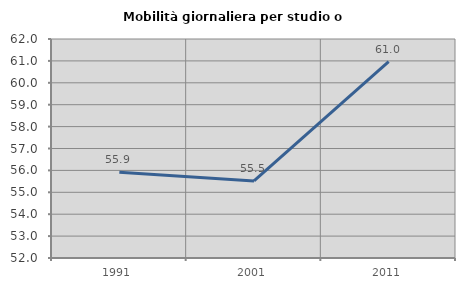
| Category | Mobilità giornaliera per studio o lavoro |
|---|---|
| 1991.0 | 55.916 |
| 2001.0 | 55.519 |
| 2011.0 | 60.972 |